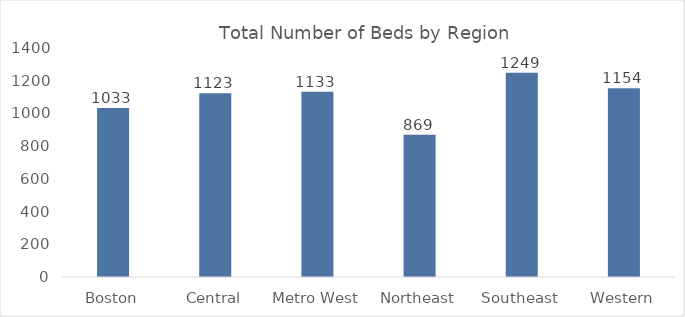
| Category | Total |
|---|---|
| Boston | 1033 |
| Central | 1123 |
| Metro West | 1133 |
| Northeast | 869 |
| Southeast | 1249 |
| Western | 1154 |